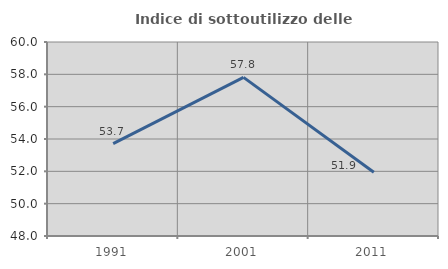
| Category | Indice di sottoutilizzo delle abitazioni  |
|---|---|
| 1991.0 | 53.716 |
| 2001.0 | 57.812 |
| 2011.0 | 51.944 |